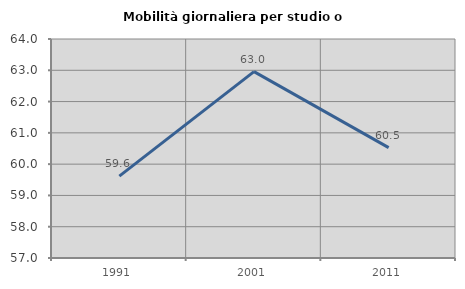
| Category | Mobilità giornaliera per studio o lavoro |
|---|---|
| 1991.0 | 59.619 |
| 2001.0 | 62.956 |
| 2011.0 | 60.526 |